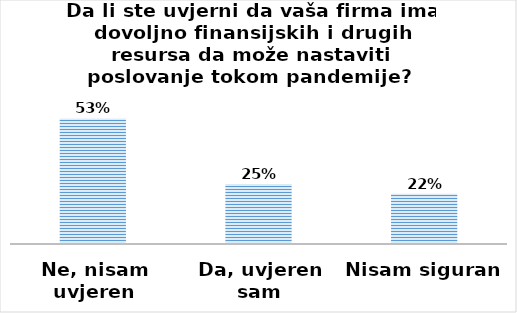
| Category | Series 0 |
|---|---|
| Ne, nisam uvjeren | 182 |
| Da, uvjeren sam | 87 |
| Nisam siguran | 73 |